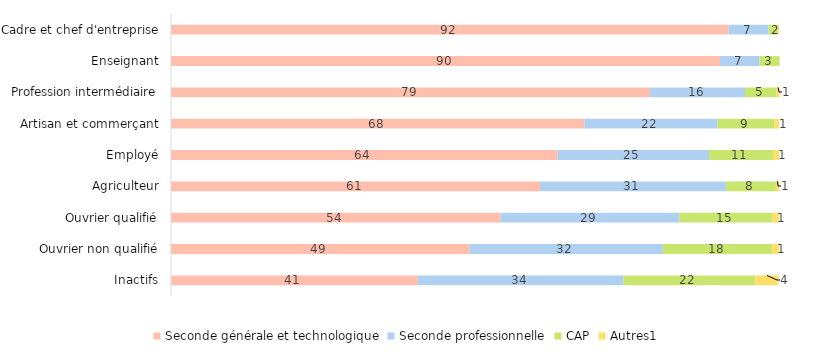
| Category | Seconde générale et technologique | Seconde professionnelle | CAP | Autres1 |
|---|---|---|---|---|
| Inactifs | 40.6 | 33.8 | 21.7 | 3.8 |
| Ouvrier non qualifié | 49.1 | 31.8 | 18 | 1.1 |
| Ouvrier qualifié | 54.2 | 29.4 | 15.3 | 1.1 |
| Agriculteur | 60.7 | 30.6 | 8.2 | 0.5 |
| Employé | 63.6 | 24.9 | 10.5 | 1 |
| Artisan et commerçant | 68 | 21.9 | 9.3 | 0.8 |
| Profession intermédiaire | 78.8 | 15.6 | 5.2 | 0.5 |
| Enseignant | 90.3 | 6.5 | 3.3 | 0 |
| Cadre et chef d'entreprise | 91.7 | 6.6 | 1.5 | 0.2 |